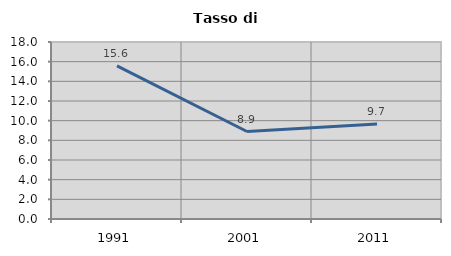
| Category | Tasso di disoccupazione   |
|---|---|
| 1991.0 | 15.565 |
| 2001.0 | 8.898 |
| 2011.0 | 9.657 |